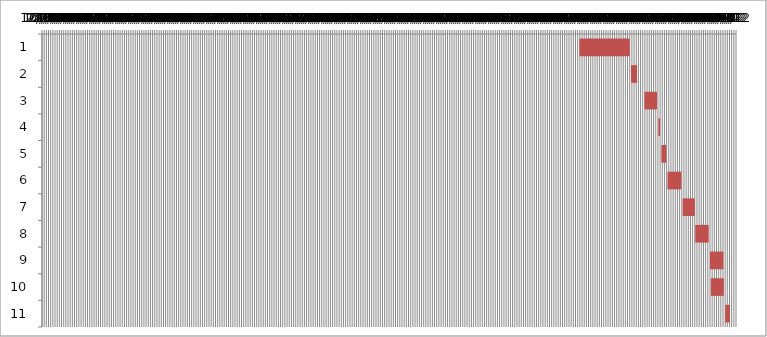
| Category | Fecha de inicio | DURACIÓN |
|---|---|---|
| 0 | 1/2/17 | 116 |
| 1 | 5/1/17 | 14 |
| 2 | 6/1/17 | 29 |
| 3 | 7/3/17 | 4 |
| 4 | 7/10/17 | 11 |
| 5 | 7/24/17 | 32 |
| 6 | 8/28/17 | 28 |
| 7 | 9/26/17 | 31 |
| 8 | 10/30/17 | 31 |
| 9 | 11/1/17 | 30 |
| 10 | 12/4/17 | 11 |